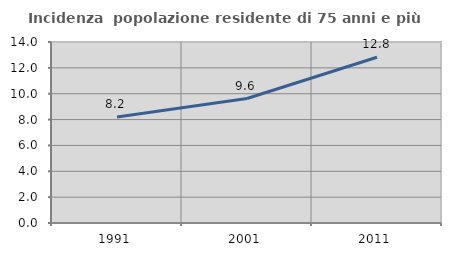
| Category | Incidenza  popolazione residente di 75 anni e più |
|---|---|
| 1991.0 | 8.2 |
| 2001.0 | 9.629 |
| 2011.0 | 12.819 |